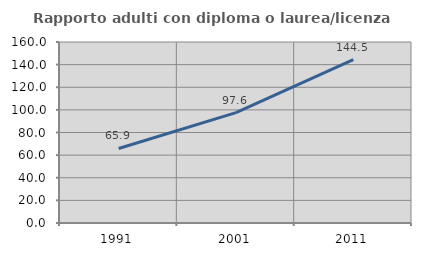
| Category | Rapporto adulti con diploma o laurea/licenza media  |
|---|---|
| 1991.0 | 65.86 |
| 2001.0 | 97.597 |
| 2011.0 | 144.5 |